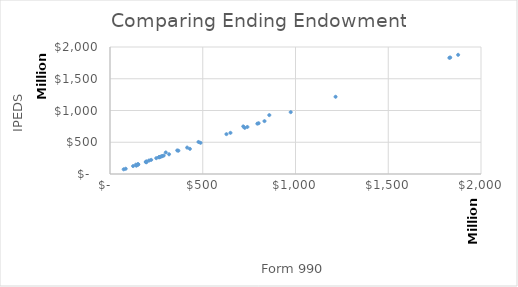
| Category | Series 0 |
|---|---|
| 300656053.0 | 339204000 |
| 858839074.0 | 927520000 |
| 477132462.0 | 504524000 |
| 139317114.0 | 146575155 |
| 718442436.0 | 749550000 |
| 362448629.0 | 371229584 |
| 149933815.0 | 152138039 |
| 210519201.0 | 212159850 |
| 649341795.0 | 647919787 |
| 488050406.0 | 490699895 |
| 198093000.0 | 198093000 |
| 1834136919.0 | 1834137000 |
| 726052159.0 | 726231559 |
| 272331405.0 | 272331405 |
| 282048169.0 | 282048000 |
| 263892125.0 | 263892125 |
| 1216030000.0 | 1216030000 |
| 267165187.0 | 267165187 |
| 740631000.0 | 740631000 |
| 73773269.0 | 73773269 |
| 627746247.0 | 627746247 |
| 289299515.0 | 289299515 |
| 151105668.0 | 151105668 |
| 222047672.0 | 222047672 |
| 124428259.0 | 124428259 |
| 832811462.0 | 832811462 |
| 249472855.0 | 249472855 |
| 265590566.0 | 265590566 |
| 1876669000.0 | 1876669000 |
| 278112603.0 | 278112603 |
| 193544650.0 | 193544650 |
| 1829521187.0 | 1829521000 |
| 2101460736.0 | 2101461000 |
| 974179926.0 | 974179926 |
| 415844050.0 | 415800000 |
| 801306901.0 | 799108339 |
| 368648473.0 | 367036697 |
| 794308177.0 | 792737205 |
| 195994889.0 | 184693333 |
| 152694312.0 | 150901016 |
| 193229937.0 | 187707113 |
| 318406736.0 | 310536027 |
| 84583810.0 | 82493657 |
| 430826413.0 | 396265465 |
| 142277624.0 | 130761615 |
| 2472706177.0 | 2149202662 |